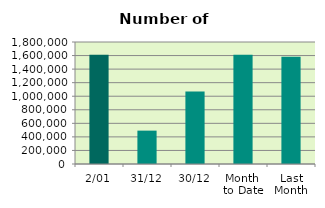
| Category | Series 0 |
|---|---|
| 2/01 | 1610316 |
| 31/12 | 492280 |
| 30/12 | 1070288 |
| Month 
to Date | 1610316 |
| Last
Month | 1583843.3 |